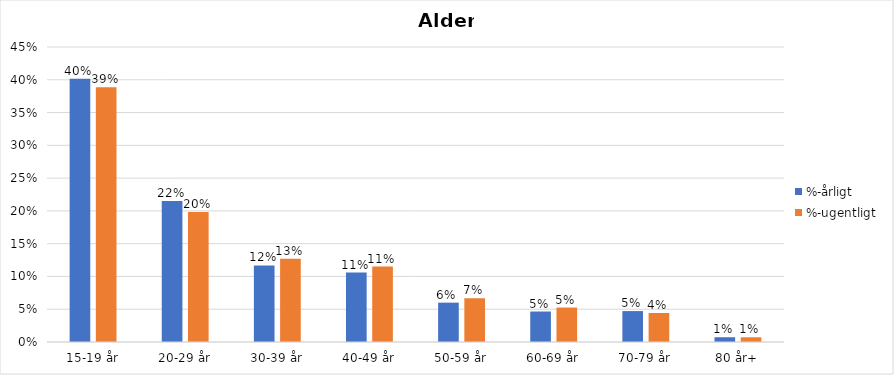
| Category | %-årligt | %-ugentligt |
|---|---|---|
| 15-19 år | 0.401 | 0.389 |
| 20-29 år | 0.215 | 0.198 |
| 30-39 år | 0.117 | 0.127 |
| 40-49 år | 0.106 | 0.115 |
| 50-59 år | 0.06 | 0.067 |
| 60-69 år | 0.047 | 0.053 |
| 70-79 år | 0.047 | 0.044 |
| 80 år+ | 0.007 | 0.007 |